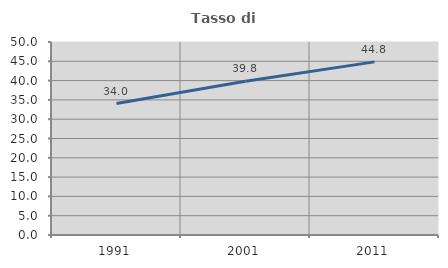
| Category | Tasso di occupazione   |
|---|---|
| 1991.0 | 34.043 |
| 2001.0 | 39.823 |
| 2011.0 | 44.847 |